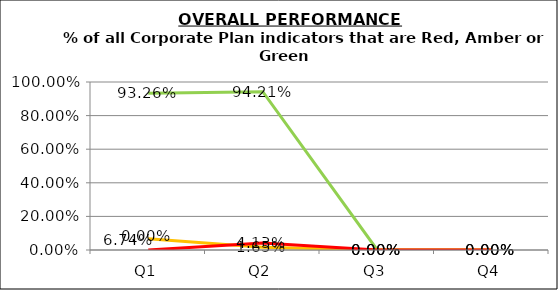
| Category | Green | Amber | Red |
|---|---|---|---|
| Q1 | 0.933 | 0.067 | 0 |
| Q2 | 0.942 | 0.017 | 0.041 |
| Q3 | 0 | 0 | 0 |
| Q4 | 0 | 0 | 0 |